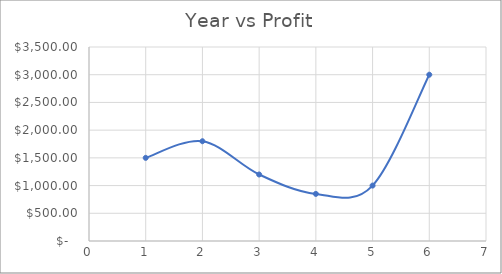
| Category | Series 0 |
|---|---|
| 1.0 | 1500 |
| 2.0 | 1800 |
| 3.0 | 1200 |
| 4.0 | 850 |
| 5.0 | 1000 |
| 6.0 | 3000 |